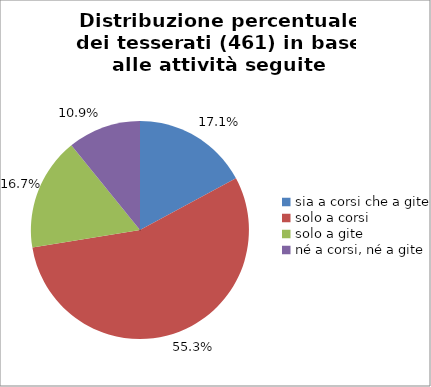
| Category | Nr. Tesserati |
|---|---|
| sia a corsi che a gite | 79 |
| solo a corsi | 255 |
| solo a gite | 77 |
| né a corsi, né a gite | 50 |